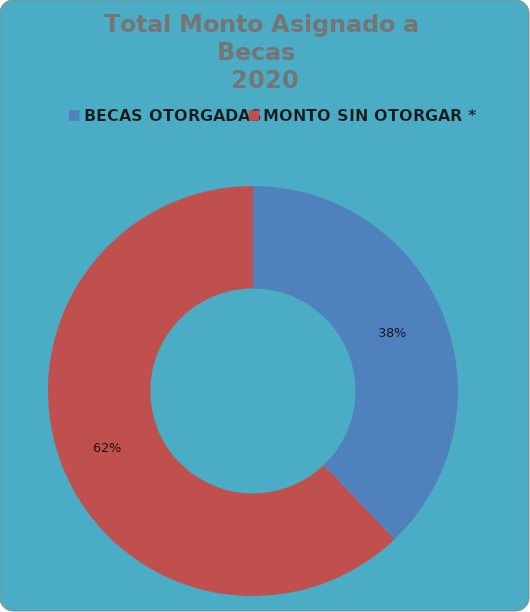
| Category | Series 0 |
|---|---|
| BECAS OTORGADAS | 417995.36 |
| MONTO SIN OTORGAR * | 686038.64 |